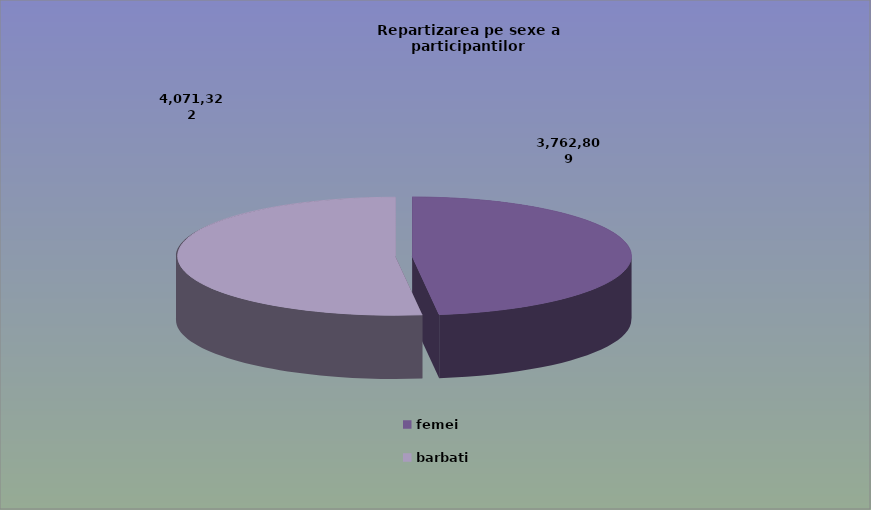
| Category | Series 0 |
|---|---|
| femei | 3762809 |
| barbati | 4071322 |